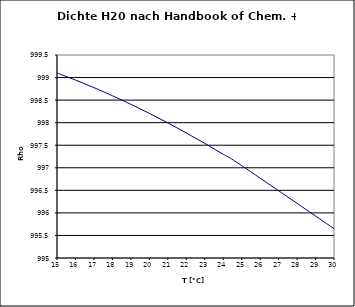
| Category | Series 0 |
|---|---|
| 15.0 | 999.102 |
| 16.0 | 998.945 |
| 17.0 | 998.777 |
| 18.0 | 998.598 |
| 19.0 | 998.407 |
| 20.0 | 998.206 |
| 21.0 | 997.995 |
| 22.0 | 997.773 |
| 23.0 | 997.541 |
| 24.0 | 997.299 |
| 25.0 | 997.048 |
| 30.0 | 995.651 |